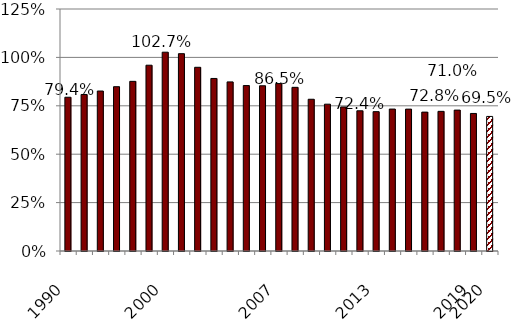
| Category | Series 0 |
|---|---|
| 1990.0 | 0.794 |
| nan | 0.808 |
| nan | 0.826 |
| nan | 0.849 |
| nan | 0.876 |
| nan | 0.96 |
| 2000.0 | 1.027 |
| nan | 1.019 |
| nan | 0.949 |
| nan | 0.891 |
| nan | 0.873 |
| nan | 0.854 |
| nan | 0.853 |
| 2007.0 | 0.865 |
| nan | 0.845 |
| nan | 0.784 |
| nan | 0.758 |
| nan | 0.744 |
| nan | 0.724 |
| 2013.0 | 0.72 |
| nan | 0.733 |
| nan | 0.733 |
| nan | 0.717 |
| nan | 0.721 |
| nan | 0.728 |
| 2019.0 | 0.71 |
| 2020.0 | 0.695 |